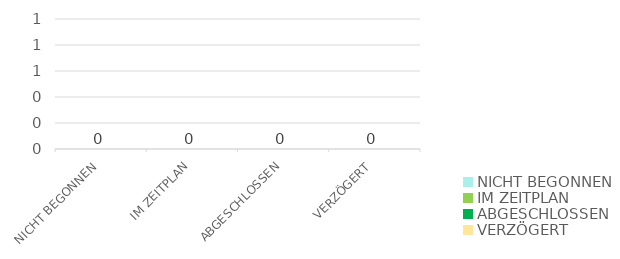
| Category | Series 0 |
|---|---|
| NICHT BEGONNEN | 0 |
| IM ZEITPLAN | 0 |
| ABGESCHLOSSEN | 0 |
| VERZÖGERT | 0 |